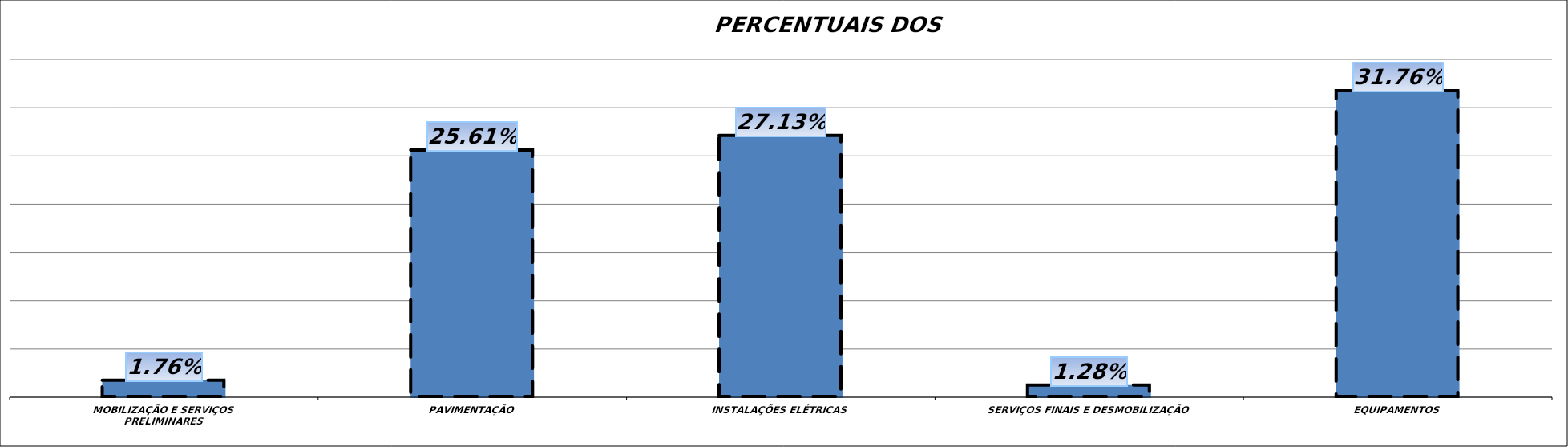
| Category | Series 0 |
|---|---|
| MOBILIZAÇÃO E SERVIÇOS PRELIMINARES | 0.018 |
| PAVIMENTAÇÃO | 0.256 |
| INSTALAÇÕES ELÉTRICAS | 0.271 |
| SERVIÇOS FINAIS E DESMOBILIZAÇÃO | 0.013 |
| EQUIPAMENTOS | 0.318 |